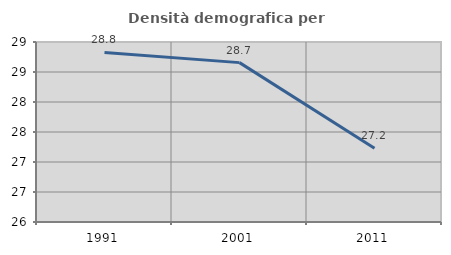
| Category | Densità demografica |
|---|---|
| 1991.0 | 28.826 |
| 2001.0 | 28.656 |
| 2011.0 | 27.229 |